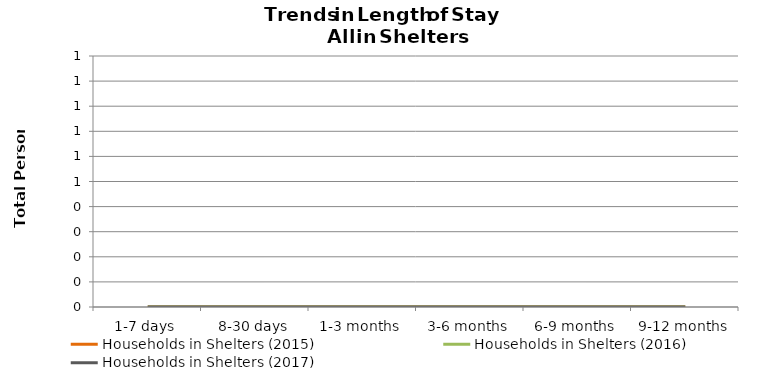
| Category | Households in Shelters (2015) | Households in Shelters (2016) | Households in Shelters (2017) |
|---|---|---|---|
| 1-7 days | 0 | 0 | 0 |
| 8-30 days | 0 | 0 | 0 |
| 1-3 months | 0 | 0 | 0 |
| 3-6 months | 0 | 0 | 0 |
| 6-9 months | 0 | 0 | 0 |
| 9-12 months | 0 | 0 | 0 |